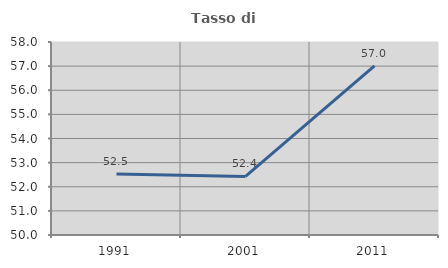
| Category | Tasso di occupazione   |
|---|---|
| 1991.0 | 52.532 |
| 2001.0 | 52.427 |
| 2011.0 | 57.009 |